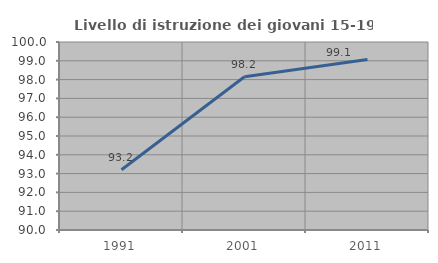
| Category | Livello di istruzione dei giovani 15-19 anni |
|---|---|
| 1991.0 | 93.201 |
| 2001.0 | 98.151 |
| 2011.0 | 99.073 |